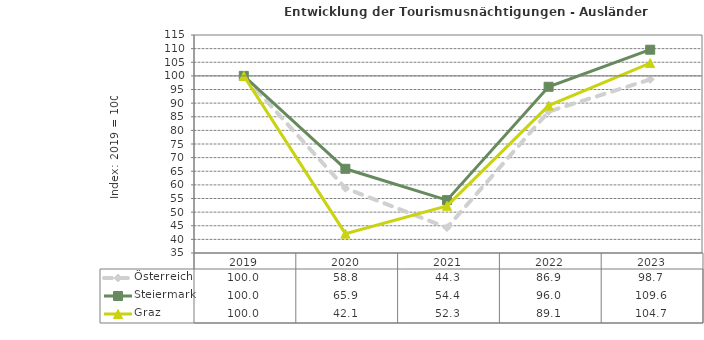
| Category | Österreich | Steiermark | Graz |
|---|---|---|---|
| 2023.0 | 98.7 | 109.6 | 104.7 |
| 2022.0 | 86.9 | 96 | 89.1 |
| 2021.0 | 44.3 | 54.4 | 52.3 |
| 2020.0 | 58.8 | 65.9 | 42.1 |
| 2019.0 | 100 | 100 | 100 |